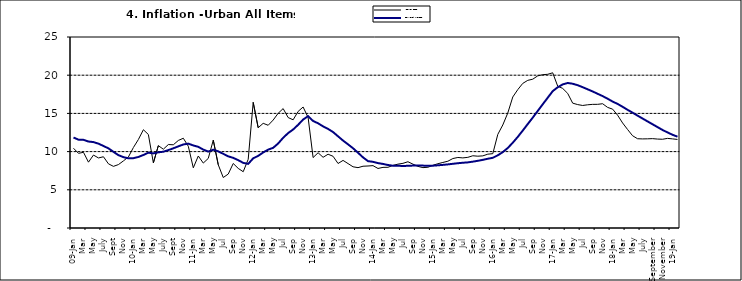
| Category | Year-on Rate | 12-Month Average |
|---|---|---|
| 09-Jan | 10.439 | 11.844 |
| Feb | 9.772 | 11.562 |
| Mar | 9.907 | 11.538 |
| Apr | 8.618 | 11.319 |
| May | 9.547 | 11.246 |
| June | 9.17 | 11.039 |
| July | 9.325 | 10.738 |
| Aug | 8.401 | 10.424 |
| Sept | 8.07 | 9.973 |
| Oct | 8.3 | 9.535 |
| Nov | 8.781 | 9.278 |
| Dec | 9.298 | 9.117 |
| 10-Jan | 10.534 | 9.136 |
| Feb | 11.584 | 9.297 |
| Mar | 12.864 | 9.555 |
| Apr | 12.24 | 9.859 |
| May | 8.524 | 9.769 |
| June | 10.781 | 9.904 |
| July | 10.313 | 9.987 |
| Aug | 10.924 | 10.197 |
| Sept | 10.891 | 10.43 |
| Oct | 11.457 | 10.689 |
| Nov | 11.748 | 10.932 |
| Dec | 10.699 | 11.042 |
| 11-Jan | 7.878 | 10.806 |
| Feb | 9.426 | 10.623 |
| Mar | 8.498 | 10.26 |
| Apr | 9.11 | 10.005 |
| May | 11.5 | 10.249 |
| Jun | 8.278 | 10.034 |
| Jul | 6.608 | 9.711 |
| Aug | 7.061 | 9.38 |
| Sep | 8.443 | 9.178 |
| Oct | 7.802 | 8.88 |
| Nov | 7.365 | 8.525 |
| Dec | 8.993 | 8.395 |
| 12-Jan | 16.445 | 9.119 |
| Feb | 13.123 | 9.443 |
| Mar | 13.701 | 9.889 |
| Apr | 13.447 | 10.259 |
| May | 14.127 | 10.496 |
| Jun | 15.012 | 11.062 |
| Jul | 15.63 | 11.81 |
| Aug | 14.456 | 12.422 |
| Sep | 14.162 | 12.893 |
| Oct | 15.26 | 13.506 |
| Nov | 15.836 | 14.199 |
| Dec | 14.459 | 14.637 |
| 13-Jan | 9.22 | 14.006 |
| Feb | 9.85 | 13.703 |
| Mar | 9.253 | 13.302 |
| Apr | 9.657 | 12.966 |
| May | 9.385 | 12.557 |
| Jun | 8.441 | 11.999 |
| Jul | 8.849 | 11.443 |
| Aug | 8.431 | 10.946 |
| Sep | 8.013 | 10.44 |
| Oct | 7.9 | 9.849 |
| Nov | 8.086 | 9.245 |
| Dec | 8.117 | 8.75 |
| 14-Jan | 8.164 | 8.662 |
| Feb | 7.791 | 8.493 |
| Mar | 7.937 | 8.384 |
| Apr | 7.947 | 8.246 |
| May | 8.195 | 8.151 |
| Jun | 8.358 | 8.146 |
| Jul | 8.464 | 8.118 |
| Aug | 8.673 | 8.141 |
| Sep | 8.357 | 8.17 |
| Oct | 8.064 | 8.182 |
| Nov | 7.902 | 8.165 |
| Dec | 7.948 | 8.151 |
| 15-Jan | 8.211 | 8.155 |
| Feb | 8.412 | 8.206 |
| Mar | 8.579 | 8.26 |
| Apr | 8.742 | 8.326 |
| May | 9.092 | 8.403 |
| Jun | 9.232 | 8.478 |
| Jul | 9.177 | 8.54 |
| Aug | 9.25 | 8.591 |
| Sep | 9.455 | 8.684 |
| Oct | 9.398 | 8.795 |
| Nov | 9.442 | 8.922 |
| Dec | 9.665 | 9.064 |
| 16-Jan | 9.728 | 9.19 |
| Feb | 12.254 | 9.516 |
| Mar | 13.485 | 9.935 |
| Apr | 15.052 | 10.474 |
| May | 17.148 | 11.165 |
| Jun | 18.111 | 11.925 |
| Jul | 18.927 | 12.754 |
| Aug | 19.325 | 13.605 |
| Sep | 19.476 | 14.444 |
| Oct | 19.914 | 15.318 |
| Nov | 20.067 | 16.193 |
| Dec | 20.118 | 17.05 |
| 17-Jan | 20.315 | 17.914 |
| Feb | 18.569 | 18.418 |
| Mar | 18.27 | 18.794 |
| Apr | 17.621 | 18.982 |
| May | 16.343 | 18.883 |
| Jun | 16.153 | 18.692 |
| Jul | 16.038 | 18.43 |
| Aug | 16.128 | 18.151 |
| Sep | 16.183 | 17.872 |
| Oct | 16.187 | 17.567 |
| Nov | 16.267 | 17.264 |
| Dec | 15.785 | 16.921 |
| 18-Jan | 15.559 | 16.55 |
| Feb | 14.763 | 16.241 |
| Mar | 13.748 | 15.866 |
| Apr | 12.893 | 15.468 |
| May | 12.077 | 15.096 |
| June | 11.683 | 14.706 |
| July | 11.661 | 14.329 |
| August | 11.673 | 13.951 |
| September | 11.697 | 13.578 |
| October | 11.64 | 13.206 |
| November | 11.615 | 12.831 |
| December | 11.731 | 12.509 |
| 19-Jan | 11.664 | 12.203 |
| February | 11.592 | 11.954 |